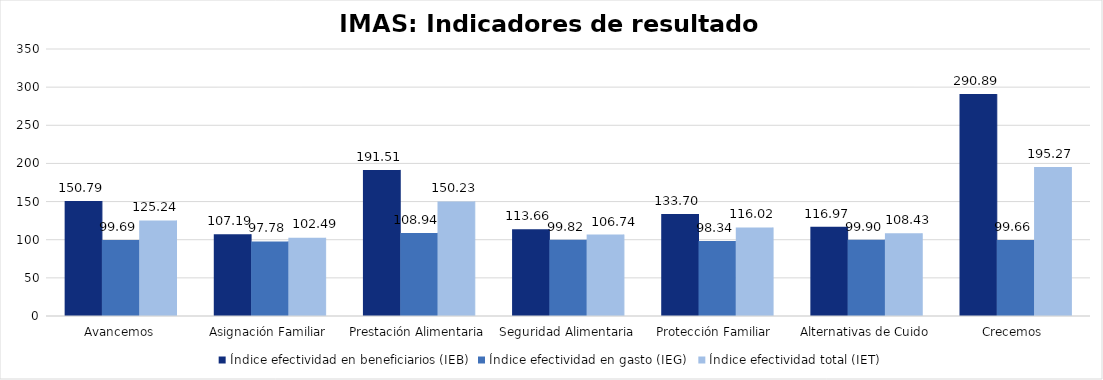
| Category |  Índice efectividad en beneficiarios (IEB)  |  Índice efectividad en gasto (IEG)   |  Índice efectividad total (IET)  |
|---|---|---|---|
|  Avancemos  | 150.79 | 99.691 | 125.24 |
|  Asignación Familiar  | 107.193 | 97.783 | 102.488 |
|  Prestación Alimentaria  | 191.509 | 108.945 | 150.227 |
|  Seguridad Alimentaria  | 113.657 | 99.815 | 106.736 |
|  Protección Familiar   | 133.703 | 98.342 | 116.022 |
|  Alternativas de Cuido  | 116.968 | 99.898 | 108.433 |
|  Crecemos   | 290.886 | 99.66 | 195.273 |